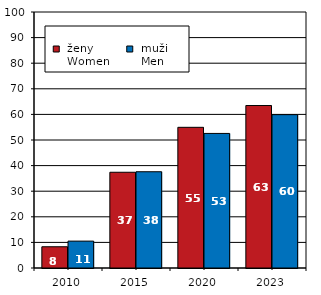
| Category |  ženy 
 Women |  muži 
 Men |
|---|---|---|
| 2010.0 | 8.3 | 10.5 |
| 2015.0 | 37.4 | 37.6 |
| 2020.0 | 54.955 | 52.565 |
| 2023.0 | 63.468 | 59.903 |